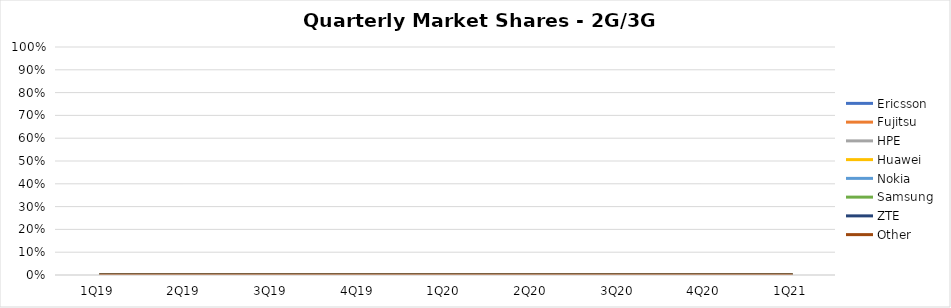
| Category | Ericsson | Fujitsu | HPE | Huawei | Nokia | Samsung | ZTE | Other |
|---|---|---|---|---|---|---|---|---|
| 1Q19 | 0 | 0 | 0 | 0 | 0 | 0 | 0 | 0 |
| 2Q19 | 0 | 0 | 0 | 0 | 0 | 0 | 0 | 0 |
| 3Q19 | 0 | 0 | 0 | 0 | 0 | 0 | 0 | 0 |
| 4Q19 | 0 | 0 | 0 | 0 | 0 | 0 | 0 | 0 |
| 1Q20 | 0 | 0 | 0 | 0 | 0 | 0 | 0 | 0 |
| 2Q20 | 0 | 0 | 0 | 0 | 0 | 0 | 0 | 0 |
| 3Q20 | 0 | 0 | 0 | 0 | 0 | 0 | 0 | 0 |
| 4Q20 | 0 | 0 | 0 | 0 | 0 | 0 | 0 | 0 |
| 1Q21 | 0 | 0 | 0 | 0 | 0 | 0 | 0 | 0 |